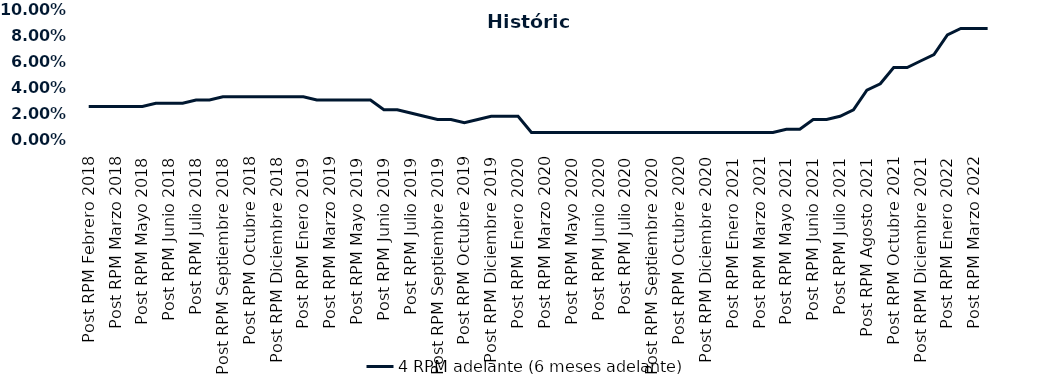
| Category | 4 RPM adelante (6 meses adelante) |
|---|---|
| Post RPM Febrero 2018 | 0.025 |
| Pre RPM Marzo 2018 | 0.025 |
| Post RPM Marzo 2018 | 0.025 |
| Pre RPM Mayo 2018 | 0.025 |
| Post RPM Mayo 2018 | 0.025 |
| Pre RPM Junio 2018 | 0.028 |
| Post RPM Junio 2018 | 0.028 |
| Pre RPM Julio 2018 | 0.028 |
| Post RPM Julio 2018 | 0.03 |
| Pre RPM Septiembre 2018 | 0.03 |
| Post RPM Septiembre 2018 | 0.032 |
| Pre RPM Octubre 2018 | 0.032 |
| Post RPM Octubre 2018 | 0.032 |
| Pre RPM Diciembre 2018 | 0.032 |
| Post RPM Diciembre 2018 | 0.032 |
| Pre RPM Enero 2019 | 0.032 |
| Post RPM Enero 2019 | 0.032 |
| Pre RPM Marzo 2019 | 0.03 |
| Post RPM Marzo 2019 | 0.03 |
| Pre RPM Mayo 2019 | 0.03 |
| Post RPM Mayo 2019 | 0.03 |
| Pre RPM Junio 2019 | 0.03 |
| Post RPM Junio 2019 | 0.022 |
| Pre RPM Julio 2019 | 0.022 |
| Post RPM Julio 2019 | 0.02 |
| Pre RPM Septiembre 2019 | 0.018 |
| Post RPM Septiembre 2019 | 0.015 |
| Pre RPM Octubre 2019 | 0.015 |
| Post RPM Octubre 2019 | 0.012 |
| Pre RPM Diciembre 2019 | 0.015 |
| Post RPM Diciembre 2019 | 0.018 |
| Pre RPM Enero 2020 | 0.018 |
| Post RPM Enero 2020 | 0.018 |
| Pre RPM Marzo 2020 | 0.005 |
| Post RPM Marzo 2020 | 0.005 |
| Pre RPM Mayo 2020 | 0.005 |
| Post RPM Mayo 2020 | 0.005 |
| Pre RPM Junio 2020 | 0.005 |
| Post RPM Junio 2020 | 0.005 |
| Pre RPM Julio 2020 | 0.005 |
| Post RPM Julio 2020 | 0.005 |
| Pre RPM Septiembre 2020 | 0.005 |
| Post RPM Septiembre 2020 | 0.005 |
| Pre RPM Octubre 2020 | 0.005 |
| Post RPM Octubre 2020 | 0.005 |
| Pre RPM Diciembre 2020 | 0.005 |
| Post RPM Diciembre 2020 | 0.005 |
| Pre RPM Enero 2021 | 0.005 |
| Post RPM Enero 2021 | 0.005 |
| Pre RPM Marzo 2021 | 0.005 |
| Post RPM Marzo 2021 | 0.005 |
| Pre RPM Mayo 2021 | 0.005 |
| Post RPM Mayo 2021 | 0.008 |
| Pre RPM Junio 2021 | 0.008 |
| Post RPM Junio 2021 | 0.015 |
| Pre RPM Julio 2021 | 0.015 |
| Post RPM Julio 2021 | 0.018 |
| Pre RPM Agosto 2021 | 0.022 |
| Post RPM Agosto 2021 | 0.038 |
| Pre RPM Octubre 2021 | 0.042 |
| Post RPM Octubre 2021 | 0.055 |
| Pre RPM Diciembre 2021 | 0.055 |
| Post RPM Diciembre 2021 | 0.06 |
| Pre RPM Enero 2022 | 0.065 |
| Post RPM Enero 2022 | 0.08 |
| Pre RPM Marzo 2022 | 0.085 |
| Post RPM Marzo 2022 | 0.085 |
| Pre RPM Mayo 2022 | 0.085 |